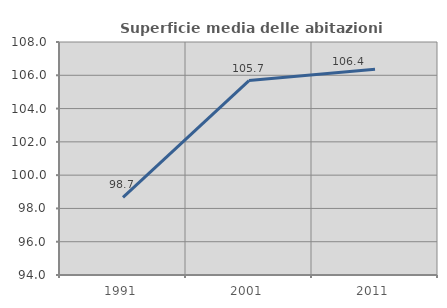
| Category | Superficie media delle abitazioni occupate |
|---|---|
| 1991.0 | 98.659 |
| 2001.0 | 105.68 |
| 2011.0 | 106.369 |